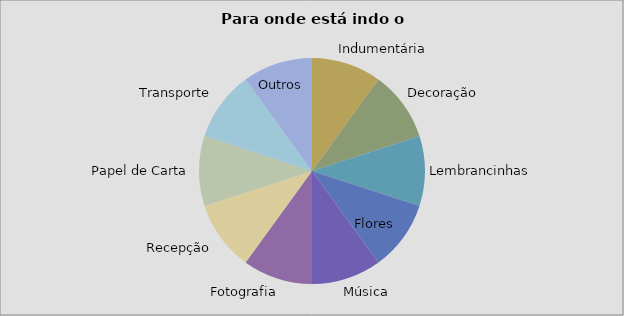
| Category | Valor |
|---|---|
| Indumentária | 1 |
| Decoração | 1 |
| Lembrancinhas | 1 |
| Flores | 1 |
| Música | 1 |
| Fotografia | 1 |
| Recepção | 1 |
| Papel de Carta | 1 |
| Transporte | 1 |
| Outros | 1 |